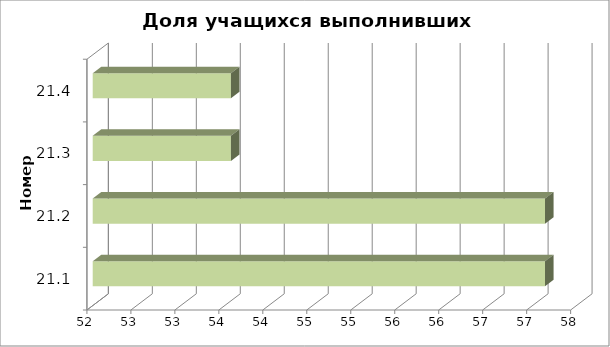
| Category | Доля учащихся выполнивших критерий |
|---|---|
| 21.1 | 57.143 |
| 21.2 | 57.143 |
| 21.3 | 53.571 |
| 21.4 | 53.571 |